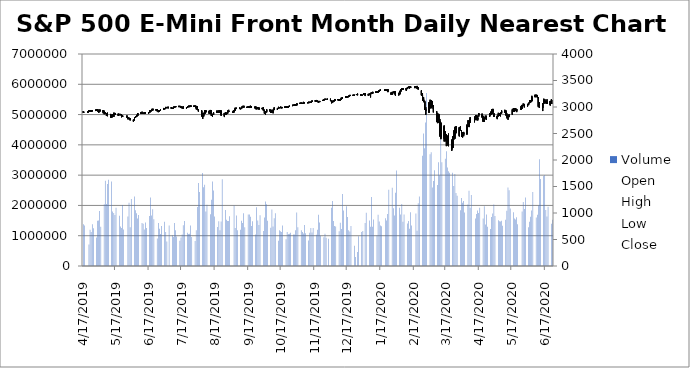
| Category | Volume |
|---|---|
| 4/17/19 | 1382265 |
| 4/18/19 | 1335778 |
| 4/22/19 | 706067 |
| 4/23/19 | 1193738 |
| 4/24/19 | 1125250 |
| 4/25/19 | 1376185 |
| 4/26/19 | 1246988 |
| 4/29/19 | 944846 |
| 4/30/19 | 1491268 |
| 5/1/19 | 1502201 |
| 5/2/19 | 1813837 |
| 5/3/19 | 1295606 |
| 5/6/19 | 2037157 |
| 5/7/19 | 2813033 |
| 5/8/19 | 2043325 |
| 5/9/19 | 2705412 |
| 5/10/19 | 2848095 |
| 5/13/19 | 2790074 |
| 5/14/19 | 1797995 |
| 5/15/19 | 1753507 |
| 5/16/19 | 1687728 |
| 5/17/19 | 1926351 |
| 5/20/19 | 1659139 |
| 5/21/19 | 1303238 |
| 5/22/19 | 1258767 |
| 5/23/19 | 2013518 |
| 5/24/19 | 1201967 |
| 5/28/19 | 1633540 |
| 5/29/19 | 2087458 |
| 5/30/19 | 1282029 |
| 5/31/19 | 2211587 |
| 6/3/19 | 2297243 |
| 6/4/19 | 1836910 |
| 6/5/19 | 1743779 |
| 6/6/19 | 1566762 |
| 6/7/19 | 1687328 |
| 6/10/19 | 1416247 |
| 6/11/19 | 1397028 |
| 6/12/19 | 1205406 |
| 6/13/19 | 1437516 |
| 6/14/19 | 1257750 |
| 6/17/19 | 1649621 |
| 6/18/19 | 2257843 |
| 6/19/19 | 1666878 |
| 6/20/19 | 1876076 |
| 6/21/19 | 1547604 |
| 6/24/19 | 910166 |
| 6/25/19 | 1417191 |
| 6/26/19 | 1232682 |
| 6/27/19 | 1060248 |
| 6/28/19 | 1322759 |
| 7/1/19 | 1457722 |
| 7/2/19 | 1119495 |
| 7/3/19 | 805258 |
| 7/5/19 | 1339312 |
| 7/8/19 | 1016611 |
| 7/9/19 | 956650 |
| 7/10/19 | 1422362 |
| 7/11/19 | 1181911 |
| 7/12/19 | 969956 |
| 7/15/19 | 829936 |
| 7/16/19 | 939814 |
| 7/17/19 | 1039457 |
| 7/18/19 | 1345038 |
| 7/19/19 | 1482373 |
| 7/22/19 | 1098399 |
| 7/23/19 | 1056909 |
| 7/24/19 | 1068766 |
| 7/25/19 | 1333721 |
| 7/26/19 | 961015 |
| 7/29/19 | 823572 |
| 7/30/19 | 1182050 |
| 7/31/19 | 1951108 |
| 8/1/19 | 2736926 |
| 8/2/19 | 2447014 |
| 8/5/19 | 3072122 |
| 8/6/19 | 2601037 |
| 8/7/19 | 2680813 |
| 8/8/19 | 1800667 |
| 8/9/19 | 2026304 |
| 8/12/19 | 1710875 |
| 8/13/19 | 2184012 |
| 8/14/19 | 2786308 |
| 8/15/19 | 2495340 |
| 8/16/19 | 1631175 |
| 8/19/19 | 1285798 |
| 8/20/19 | 1475214 |
| 8/21/19 | 1180368 |
| 8/22/19 | 1470309 |
| 8/23/19 | 2864662 |
| 8/26/19 | 1850231 |
| 8/27/19 | 1528362 |
| 8/28/19 | 1489617 |
| 8/29/19 | 1489670 |
| 8/30/19 | 1642516 |
| 9/3/19 | 1999829 |
| 9/4/19 | 1252834 |
| 9/5/19 | 1669999 |
| 9/6/19 | 1182287 |
| 9/9/19 | 1199935 |
| 9/10/19 | 1493346 |
| 9/11/19 | 1423833 |
| 9/12/19 | 1745651 |
| 9/13/19 | 1275710 |
| 9/16/19 | 1698082 |
| 9/17/19 | 1699010 |
| 9/18/19 | 1623840 |
| 9/19/19 | 1323245 |
| 9/20/19 | 1476593 |
| 9/23/19 | 1044218 |
| 9/24/19 | 1936806 |
| 9/25/19 | 1501723 |
| 9/26/19 | 1351351 |
| 9/27/19 | 1673557 |
| 9/30/19 | 1155807 |
| 10/1/19 | 1601531 |
| 10/2/19 | 2126769 |
| 10/3/19 | 2037970 |
| 10/4/19 | 1497975 |
| 10/7/19 | 1266872 |
| 10/8/19 | 1865325 |
| 10/9/19 | 1305749 |
| 10/10/19 | 1577766 |
| 10/11/19 | 1743810 |
| 10/14/19 | 833670 |
| 10/15/19 | 1181207 |
| 10/16/19 | 1148118 |
| 10/17/19 | 1121748 |
| 10/18/19 | 1335276 |
| 10/21/19 | 886557 |
| 10/22/19 | 1125601 |
| 10/23/19 | 1055958 |
| 10/24/19 | 1061278 |
| 10/25/19 | 1098391 |
| 10/28/19 | 1041931 |
| 10/29/19 | 1040149 |
| 10/30/19 | 1179153 |
| 10/31/19 | 1766536 |
| 11/1/19 | 1279508 |
| 11/4/19 | 1179714 |
| 11/5/19 | 1124217 |
| 11/6/19 | 1076833 |
| 11/7/19 | 1353330 |
| 11/8/19 | 1080147 |
| 11/11/19 | 844597 |
| 11/12/19 | 1101243 |
| 11/13/19 | 1251057 |
| 11/14/19 | 1105353 |
| 11/15/19 | 1251167 |
| 11/18/19 | 1034214 |
| 11/19/19 | 1195901 |
| 11/20/19 | 1693828 |
| 11/21/19 | 1434552 |
| 11/22/19 | 995416 |
| 11/25/19 | 947831 |
| 11/26/19 | 1068011 |
| 11/27/19 | 928792 |
| 11/29/19 | 902189 |
| 12/2/19 | 1927030 |
| 12/3/19 | 2146620 |
| 12/4/19 | 1485940 |
| 12/5/19 | 1318780 |
| 12/6/19 | 1300299 |
| 12/9/19 | 1145426 |
| 12/10/19 | 1425723 |
| 12/11/19 | 1225764 |
| 12/12/19 | 2379008 |
| 12/13/19 | 1834941 |
| 12/16/19 | 1973586 |
| 12/17/19 | 1615320 |
| 12/18/19 | 1181642 |
| 12/19/19 | 1137443 |
| 12/20/19 | 1320006 |
| 12/23/19 | 665895 |
| 12/24/19 | 297971 |
| 12/26/19 | 464639 |
| 12/27/19 | 984389 |
| 12/30/19 | 1124598 |
| 12/31/19 | 1157924 |
| 1/2/20 | 1416241 |
| 1/3/20 | 1755057 |
| 1/6/20 | 1502748 |
| 1/7/20 | 1293494 |
| 1/8/20 | 2279138 |
| 1/9/20 | 1297679 |
| 1/10/20 | 1533121 |
| 1/13/20 | 1008998 |
| 1/14/20 | 1694799 |
| 1/15/20 | 1468347 |
| 1/16/20 | 1335246 |
| 1/17/20 | 1312253 |
| 1/21/20 | 1573187 |
| 1/22/20 | 1505107 |
| 1/23/20 | 1717046 |
| 1/24/20 | 2515168 |
| 1/27/20 | 2581636 |
| 1/28/20 | 1910878 |
| 1/29/20 | 1665382 |
| 1/30/20 | 2421276 |
| 1/31/20 | 3152069 |
| 2/3/20 | 1919477 |
| 2/4/20 | 1698403 |
| 2/5/20 | 2046111 |
| 2/6/20 | 1462323 |
| 2/7/20 | 1698940 |
| 2/10/20 | 1399815 |
| 2/11/20 | 1486164 |
| 2/12/20 | 1229231 |
| 2/13/20 | 1772784 |
| 2/14/20 | 1334897 |
| 2/18/20 | 1735931 |
| 2/19/20 | 1163426 |
| 2/20/20 | 2073749 |
| 2/21/20 | 2293728 |
| 2/24/20 | 3636687 |
| 2/25/20 | 4375530 |
| 2/26/20 | 3889097 |
| 2/27/20 | 4734434 |
| 2/28/20 | 5715227 |
| 3/2/20 | 3689149 |
| 3/3/20 | 3754363 |
| 3/4/20 | 2590464 |
| 3/5/20 | 2807262 |
| 3/6/20 | 3163400 |
| 3/9/20 | 2672753 |
| 3/10/20 | 3423140 |
| 3/11/20 | 2992894 |
| 3/12/20 | 4366577 |
| 3/13/20 | 3423449 |
| 3/16/20 | 3539756 |
| 3/17/20 | 3788132 |
| 3/18/20 | 3255696 |
| 3/19/20 | 3127808 |
| 3/20/20 | 3075997 |
| 3/23/20 | 3076791 |
| 3/24/20 | 2639522 |
| 3/25/20 | 3037767 |
| 3/26/20 | 2413913 |
| 3/27/20 | 2320755 |
| 3/30/20 | 1837692 |
| 3/31/20 | 2248012 |
| 4/1/20 | 2091378 |
| 4/2/20 | 2145458 |
| 4/3/20 | 1763886 |
| 4/6/20 | 2034419 |
| 4/7/20 | 2486524 |
| 4/8/20 | 1920688 |
| 4/9/20 | 2342733 |
| 4/13/20 | 1571402 |
| 4/14/20 | 1716496 |
| 4/15/20 | 1831570 |
| 4/16/20 | 1749108 |
| 4/17/20 | 1924019 |
| 4/20/20 | 1566934 |
| 4/21/20 | 1969844 |
| 4/22/20 | 1369529 |
| 4/23/20 | 1703918 |
| 4/24/20 | 1293756 |
| 4/27/20 | 1224445 |
| 4/28/20 | 1614021 |
| 4/29/20 | 1737371 |
| 4/30/20 | 2027924 |
| 5/1/20 | 1647259 |
| 5/4/20 | 1510680 |
| 5/5/20 | 1474765 |
| 5/6/20 | 1466641 |
| 5/7/20 | 1494330 |
| 5/8/20 | 1326254 |
| 5/11/20 | 1528302 |
| 5/12/20 | 1824303 |
| 5/13/20 | 2591379 |
| 5/14/20 | 2501222 |
| 5/15/20 | 1897194 |
| 5/18/20 | 1775433 |
| 5/19/20 | 1567224 |
| 5/20/20 | 1532404 |
| 5/21/20 | 1608225 |
| 5/22/20 | 1377263 |
| 5/26/20 | 1797241 |
| 5/27/20 | 2109332 |
| 5/28/20 | 1881295 |
| 5/29/20 | 2258009 |
| 6/1/20 | 1277803 |
| 6/2/20 | 1458830 |
| 6/3/20 | 1623708 |
| 6/4/20 | 1830904 |
| 6/5/20 | 2444330 |
| 6/8/20 | 1602601 |
| 6/9/20 | 1695764 |
| 6/10/20 | 1996065 |
| 6/11/20 | 3528726 |
| 6/12/20 | 2872339 |
| 6/15/20 | 2970664 |
| 6/16/20 | 2997253 |
| 6/17/20 | 1850300 |
| 6/18/20 | 1636217 |
| 6/19/20 | 1952273 |
| 6/22/20 | 1392325 |
| 6/23/20 | 1528485 |
| 6/24/20 | 822171 |